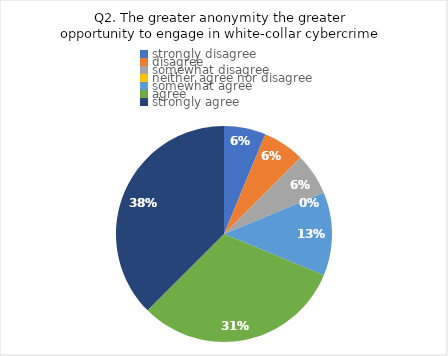
| Category | Series 0 |
|---|---|
| strongly disagree | 1 |
| disagree | 1 |
| somewhat disagree | 1 |
| neither agree nor disagree | 0 |
| somewhat agree | 2 |
| agree | 5 |
| strongly agree | 6 |